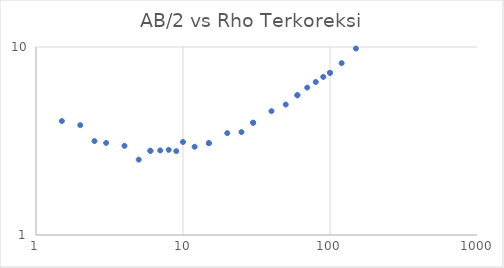
| Category | Series 0 |
|---|---|
| 1.5 | 4.038 |
| 2.0 | 3.84 |
| 2.5 | 3.159 |
| 3.0 | 3.088 |
| 4.0 | 2.982 |
| 5.0 | 2.517 |
| 6.0 | 2.806 |
| 6.0 | 2.806 |
| 7.0 | 2.817 |
| 8.0 | 2.837 |
| 9.0 | 2.794 |
| 10.0 | 3.124 |
| 12.0 | 2.948 |
| 15.0 | 3.081 |
| 15.0 | 3.081 |
| 20.0 | 3.482 |
| 25.0 | 3.525 |
| 30.0 | 3.954 |
| 30.0 | 3.954 |
| 40.0 | 4.558 |
| 50.0 | 4.944 |
| 60.0 | 5.539 |
| 60.0 | 5.539 |
| 70.0 | 6.082 |
| 80.0 | 6.515 |
| 90.0 | 6.935 |
| 100.0 | 7.286 |
| 100.0 | 7.286 |
| 120.0 | 8.207 |
| 150.0 | 9.812 |